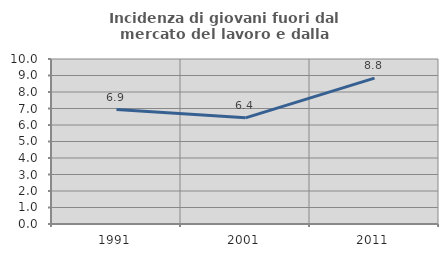
| Category | Incidenza di giovani fuori dal mercato del lavoro e dalla formazione  |
|---|---|
| 1991.0 | 6.934 |
| 2001.0 | 6.434 |
| 2011.0 | 8.843 |